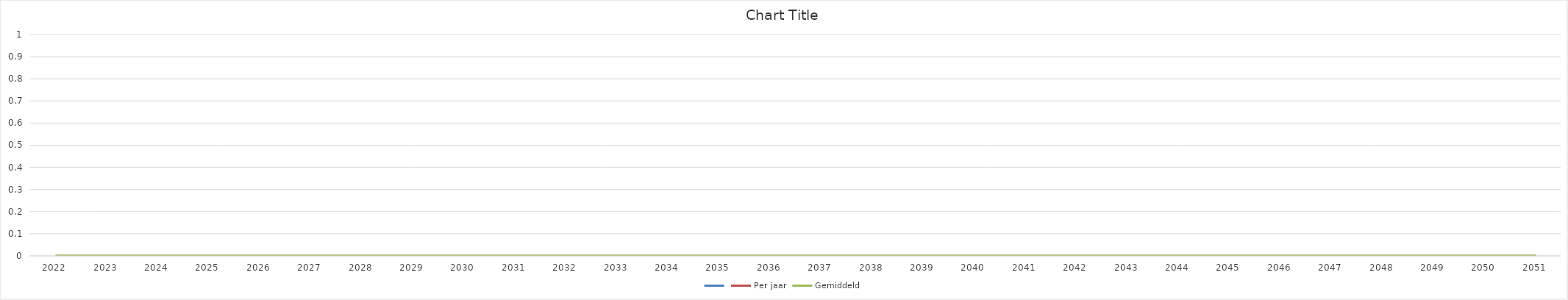
| Category | Series 0 | Per jaar | Gemiddeld |
|---|---|---|---|
| 2022.0 |  | 0 | 0 |
| 2023.0 |  | 0 | 0 |
| 2024.0 |  | 0 | 0 |
| 2025.0 |  | 0 | 0 |
| 2026.0 |  | 0 | 0 |
| 2027.0 |  | 0 | 0 |
| 2028.0 |  | 0 | 0 |
| 2029.0 |  | 0 | 0 |
| 2030.0 |  | 0 | 0 |
| 2031.0 |  | 0 | 0 |
| 2032.0 |  | 0 | 0 |
| 2033.0 |  | 0 | 0 |
| 2034.0 |  | 0 | 0 |
| 2035.0 |  | 0 | 0 |
| 2036.0 |  | 0 | 0 |
| 2037.0 |  | 0 | 0 |
| 2038.0 |  | 0 | 0 |
| 2039.0 |  | 0 | 0 |
| 2040.0 |  | 0 | 0 |
| 2041.0 |  | 0 | 0 |
| 2042.0 |  | 0 | 0 |
| 2043.0 |  | 0 | 0 |
| 2044.0 |  | 0 | 0 |
| 2045.0 |  | 0 | 0 |
| 2046.0 |  | 0 | 0 |
| 2047.0 |  | 0 | 0 |
| 2048.0 |  | 0 | 0 |
| 2049.0 |  | 0 | 0 |
| 2050.0 |  | 0 | 0 |
| 2051.0 |  | 0 | 0 |